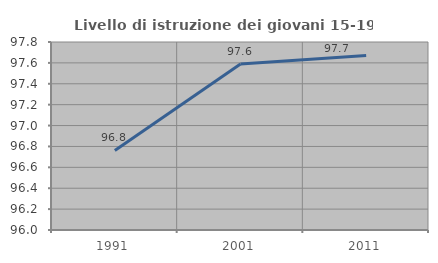
| Category | Livello di istruzione dei giovani 15-19 anni |
|---|---|
| 1991.0 | 96.762 |
| 2001.0 | 97.59 |
| 2011.0 | 97.671 |